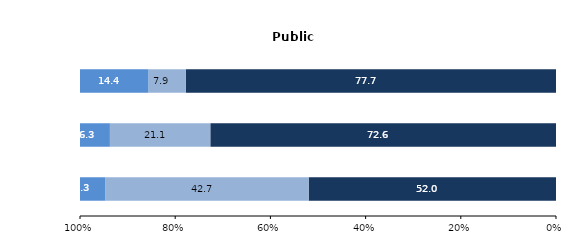
| Category | État | Collectivités territoriales | Autres (1) |
|---|---|---|---|
| Établissements du premier degré
(écoles maternelles et élémentaires) | 51.958 | 42.748 | 5.294 |
| Établissements du second degré
(collèges et lycées) | 72.625 | 21.097 | 6.279 |
| Établissements du supérieur (2) | 77.745 | 7.883 | 14.372 |